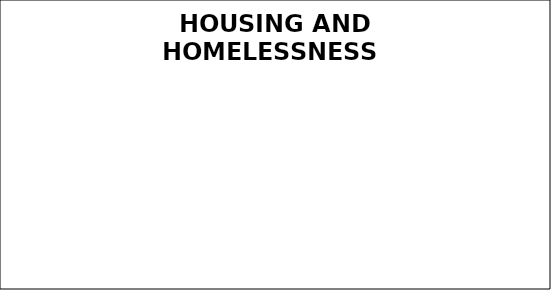
| Category | Series 0 |
|---|---|
| Green | 0 |
| Amber | 0 |
| Red | 0 |